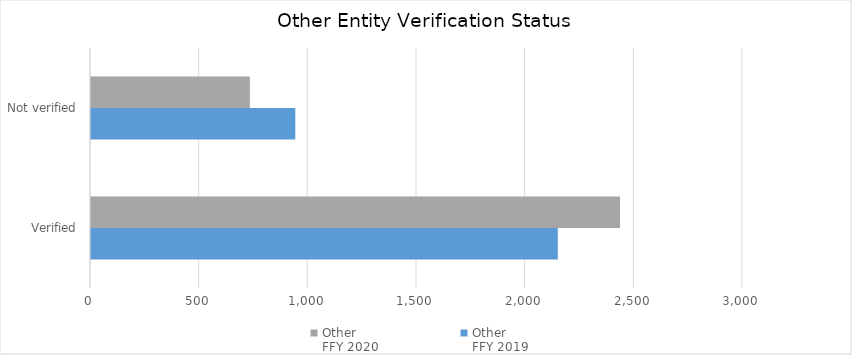
| Category | Other 
FFY 2019 | Other 
FFY 2020 |
|---|---|---|
| Verified | 2148 | 2434 |
| Not verified | 940 | 731 |